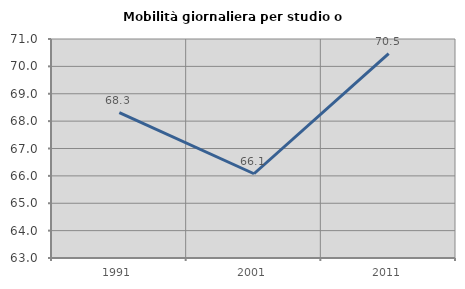
| Category | Mobilità giornaliera per studio o lavoro |
|---|---|
| 1991.0 | 68.306 |
| 2001.0 | 66.078 |
| 2011.0 | 70.468 |